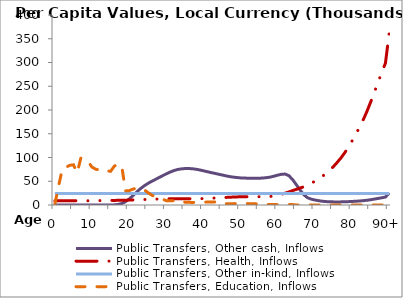
| Category | Public Transfers, Other cash, Inflows | Public Transfers, Health, Inflows | Public Transfers, Other in-kind, Inflows | Public Transfers, Education, Inflows |
|---|---|---|---|---|
| 0 | 0 | 8886.3 | 24310.147 | 1683.394 |
|  | 0 | 8886.3 | 24310.147 | 39695.76 |
| 2 | 0 | 8886.3 | 24310.147 | 75808.341 |
| 3 | 0 | 8886.3 | 24310.147 | 79378.98 |
| 4 | 0 | 8886.3 | 24310.147 | 83548.309 |
| 5 | 0 | 8886.3 | 24310.147 | 84640.315 |
| 6 | 0 | 8886.3 | 24310.147 | 67719.116 |
| 7 | 0 | 8889.363 | 24310.147 | 99023.447 |
| 8 | 0 | 8906.819 | 24310.147 | 96012.027 |
| 9 | 0 | 8947.693 | 24310.147 | 90871.496 |
| 10 | 0 | 9014.393 | 24310.147 | 79808.508 |
| 11 | 0 | 9103.403 | 24310.147 | 75315.585 |
| 12 | 0 | 9208.155 | 24310.147 | 74071.104 |
| 13 | 0 | 9321.862 | 24310.147 | 70594.53 |
| 14 | 0 | 9439.269 | 24310.147 | 71991.213 |
| 15 | 0 | 9557.561 | 24310.147 | 70862.256 |
| 16 | 284.148 | 9675.72 | 24310.147 | 81791.858 |
| 17 | 1000.666 | 9798.338 | 24310.147 | 86255.72 |
| 18 | 3001.439 | 9947.251 | 24310.147 | 82592.397 |
| 19 | 6925.246 | 10137.665 | 24310.147 | 29873.063 |
| 20 | 12604.324 | 10368.694 | 24310.147 | 30196.056 |
| 21 | 19533.081 | 10628.242 | 24310.147 | 33355.121 |
| 22 | 27095.554 | 10902.519 | 24310.147 | 35867.907 |
| 23 | 34152.428 | 11183.609 | 24310.147 | 35666.717 |
| 24 | 40047.04 | 11469.481 | 24310.147 | 32538.88 |
| 25 | 45112.336 | 11756.177 | 24310.147 | 26493.437 |
| 26 | 49563.752 | 12041.297 | 24310.147 | 21106.336 |
| 27 | 53534.435 | 12317.927 | 24310.147 | 17165.314 |
| 28 | 57534.388 | 12573.061 | 24310.147 | 14642.946 |
| 29 | 61655.086 | 12789.913 | 24310.147 | 12227.189 |
| 30 | 65576.978 | 12952.413 | 24310.147 | 9193.019 |
| 31 | 69227.485 | 13051.994 | 24310.147 | 9013.917 |
| 32 | 72369.31 | 13094.433 | 24310.147 | 8921.66 |
| 33 | 74631.482 | 13101.984 | 24310.147 | 9178.733 |
| 34 | 75974.074 | 13101.984 | 24310.147 | 9239.283 |
| 35 | 76687.335 | 13101.984 | 24310.147 | 5885.431 |
| 36 | 76825.046 | 13101.984 | 24310.147 | 5566.392 |
| 37 | 76321.682 | 13113.143 | 24310.147 | 5489.964 |
| 38 | 75255.768 | 13175.873 | 24310.147 | 5471.257 |
| 39 | 73806.014 | 13323.063 | 24310.147 | 5466.551 |
| 40 | 72033.778 | 13563.253 | 24310.147 | 5869.607 |
| 41 | 70184.772 | 13883.78 | 24310.147 | 6141.374 |
| 42 | 68416.478 | 14260.821 | 24310.147 | 6329.827 |
| 43 | 66698.842 | 14669.303 | 24310.147 | 6407.946 |
| 44 | 64956.048 | 15089.794 | 24310.147 | 6345.566 |
| 45 | 63226.395 | 15512.02 | 24310.147 | 2887.684 |
| 46 | 61470.932 | 15932.512 | 24310.147 | 2848.984 |
| 47 | 59919.745 | 16340.994 | 24310.147 | 2835.708 |
| 48 | 58742.473 | 16718.035 | 24310.147 | 2874.449 |
| 49 | 57804.333 | 17038.561 | 24310.147 | 2931.93 |
| 50 | 57071.324 | 17278.751 | 24310.147 | 2862.721 |
| 51 | 56686.084 | 17425.942 | 24310.147 | 2881.717 |
| 52 | 56466.399 | 17488.671 | 24310.147 | 2907.81 |
| 53 | 56345.461 | 17499.831 | 24310.147 | 2793.558 |
| 54 | 56265.994 | 17499.831 | 24310.147 | 2696.621 |
| 55 | 56327.102 | 17499.831 | 24310.147 | 1095.177 |
| 56 | 56791.683 | 17499.831 | 24310.147 | 1086.588 |
| 57 | 57598.868 | 17571.364 | 24310.147 | 1076.074 |
| 58 | 58742.461 | 17973.45 | 24310.147 | 1087.222 |
| 59 | 60684.387 | 18916.916 | 24310.147 | 1106.913 |
| 60 | 62884.4 | 20456.491 | 24310.147 | 649.717 |
| 61 | 64673.323 | 22511.019 | 24310.147 | 706.68 |
| 62 | 65129.812 | 24927.793 | 24310.147 | 792.985 |
| 63 | 61741.805 | 27546.094 | 24310.147 | 832.418 |
| 64 | 53567.002 | 30241.375 | 24310.147 | 831.431 |
| 65 | 42919.835 | 32947.775 | 24310.147 | 0 |
| 66 | 31724.409 | 35643.058 | 24310.147 | 0 |
| 67 | 21806.837 | 38402.228 | 24310.147 | 0 |
| 68 | 15418.282 | 41610.817 | 24310.147 | 0 |
| 69 | 12337.282 | 45523.283 | 24310.147 | 0 |
| 70 | 10527.788 | 50094.702 | 24310.147 | 0 |
| 71 | 9093.304 | 55084.088 | 24310.147 | 0 |
| 72 | 7979.308 | 60361.791 | 24310.147 | 0 |
| 73 | 7186.755 | 66243.395 | 24310.147 | 0 |
| 74 | 6751.684 | 73085.528 | 24310.147 | 0 |
| 75 | 6575.605 | 80919.032 | 24310.147 | 0 |
| 76 | 6527.257 | 89568.125 | 24310.147 | 0 |
| 77 | 6573.293 | 98925.613 | 24310.147 | 0 |
| 78 | 6747.512 | 109465.603 | 24310.147 | 0 |
| 79 | 7072.32 | 121467.318 | 24310.147 | 0 |
| 80 | 7454.851 | 134730.164 | 24310.147 | 0 |
| 81 | 7900.251 | 148750.845 | 24310.147 | 0 |
| 82 | 8420.02 | 163265.751 | 24310.147 | 0 |
| 83 | 9118.879 | 179015.731 | 24310.147 | 0 |
| 84 | 9984.966 | 196703.146 | 24310.147 | 0 |
| 85 | 11055.631 | 216211.314 | 24310.147 | 0 |
| 86 | 12406.842 | 236967.871 | 24310.147 | 0 |
| 87 | 13820.552 | 258142.26 | 24310.147 | 0 |
| 88 | 15163.01 | 278900.44 | 24310.147 | 0 |
| 89 | 16664.799 | 298508.51 | 24310.147 | 0 |
| 90+ | 25413.008 | 361075.569 | 24310.147 | 0 |